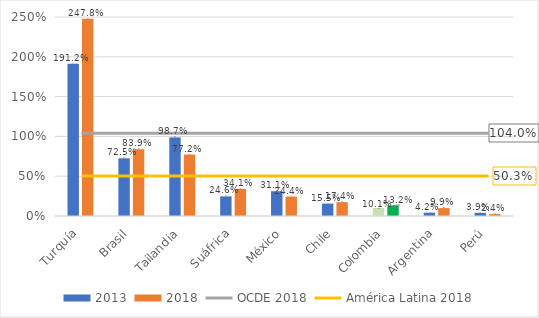
| Category | 2013 | 2018 |
|---|---|---|
| Turquía | 1.912 | 2.478 |
| Brasil | 0.725 | 0.839 |
| Tailandia | 0.987 | 0.772 |
| Suáfrica | 0.246 | 0.341 |
| México | 0.311 | 0.244 |
| Chile | 0.155 | 0.174 |
| Colombia | 0.101 | 0.132 |
| Argentina | 0.042 | 0.099 |
| Perú | 0.039 | 0.024 |